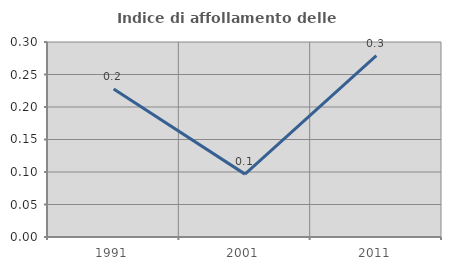
| Category | Indice di affollamento delle abitazioni  |
|---|---|
| 1991.0 | 0.228 |
| 2001.0 | 0.097 |
| 2011.0 | 0.279 |